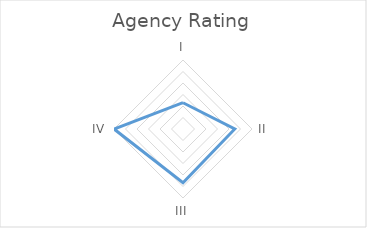
| Category | Series 0 |
|---|---|
| I | 1.143 |
| II | 2.25 |
| III | 2.333 |
| IV | 3 |